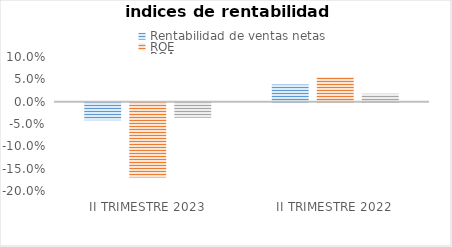
| Category | Rentabilidad de ventas netas | ROE | ROA |
|---|---|---|---|
| II TRIMESTRE 2023 | -0.039 | -0.167 | -0.034 |
| II TRIMESTRE 2022 | 0.038 | 0.055 | 0.018 |